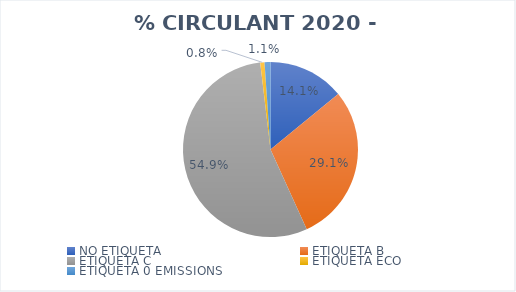
| Category | % CIRCULANT 2020 |
|---|---|
| NO ETIQUETA | 0.141 |
| ETIQUETA B | 0.291 |
| ETIQUETA C | 0.549 |
| ETIQUETA ECO | 0.008 |
| ETIQUETA 0 EMISSIONS | 0.011 |